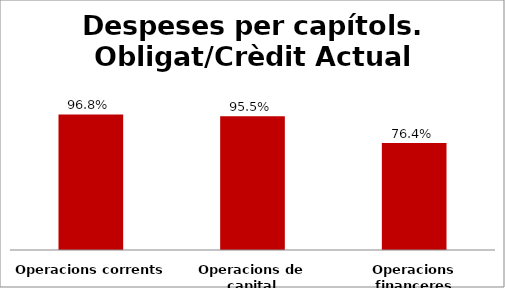
| Category | Series 0 |
|---|---|
| Operacions corrents | 0.968 |
| Operacions de capital | 0.955 |
| Operacions financeres | 0.764 |